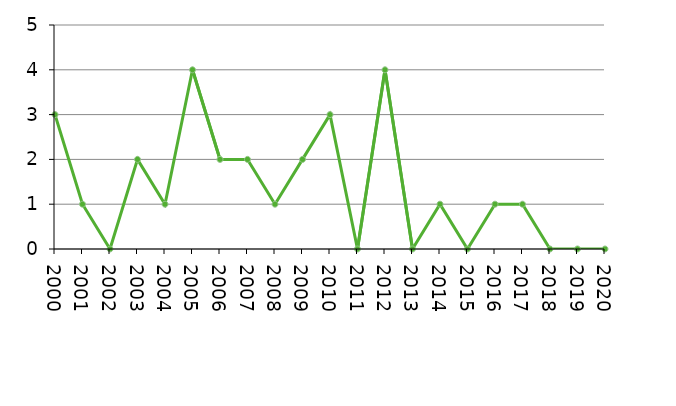
| Category | Avlidna |
|---|---|
| 2000 | 3 |
| 2001 | 1 |
| 2002 | 0 |
| 2003 | 2 |
| 2004 | 1 |
| 2005 | 4 |
| 2006 | 2 |
| 2007 | 2 |
| 2008 | 1 |
| 2009 | 2 |
| 2010 | 3 |
| 2011 | 0 |
| 2012 | 4 |
| 2013 | 0 |
| 2014 | 1 |
| 2015 | 0 |
| 2016 | 1 |
| 2017 | 1 |
| 2018 | 0 |
| 2019 | 0 |
| 2020 | 0 |